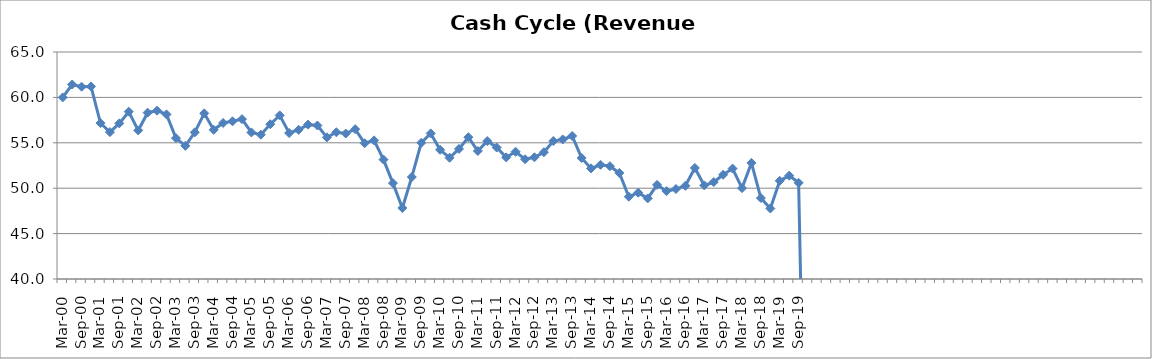
| Category | Series 0 |
|---|---|
| Mar-00 | 59.999 |
| Jun-00 | 61.42 |
| Sep-00 | 61.18 |
| Dec-00 | 61.208 |
| Mar-01 | 57.172 |
| Jun-01 | 56.177 |
| Sep-01 | 57.14 |
| Dec-01 | 58.427 |
| Mar-02 | 56.367 |
| Jun-02 | 58.318 |
| Sep-02 | 58.539 |
| Dec-02 | 58.126 |
| Mar-03 | 55.517 |
| Jun-03 | 54.667 |
| Sep-03 | 56.155 |
| Dec-03 | 58.246 |
| Mar-04 | 56.431 |
| Jun-04 | 57.187 |
| Sep-04 | 57.367 |
| Dec-04 | 57.605 |
| Mar-05 | 56.143 |
| Jun-05 | 55.893 |
| Sep-05 | 57.043 |
| Dec-05 | 58.02 |
| Mar-06 | 56.077 |
| Jun-06 | 56.43 |
| Sep-06 | 56.998 |
| Dec-06 | 56.905 |
| Mar-07 | 55.598 |
| Jun-07 | 56.163 |
| Sep-07 | 56.023 |
| Dec-07 | 56.498 |
| Mar-08 | 54.952 |
| Jun-08 | 55.266 |
| Sep-08 | 53.153 |
| Dec-08 | 50.562 |
| Mar-09 | 47.819 |
| Jun-09 | 51.23 |
| Sep-09 | 55.001 |
| Dec-09 | 56.034 |
| Mar-10 | 54.226 |
| Jun-10 | 53.354 |
| Sep-10 | 54.325 |
| Dec-10 | 55.616 |
| Mar-11 | 54.095 |
| Jun-11 | 55.191 |
| Sep-11 | 54.482 |
| Dec-11 | 53.393 |
| Mar-12 | 54.015 |
| Jun-12 | 53.19 |
| Sep-12 | 53.404 |
| Dec-12 | 53.963 |
| Mar-13 | 55.194 |
| Jun-13 | 55.37 |
| Sep-13 | 55.752 |
| Dec-13 | 53.329 |
| Mar-14 | 52.181 |
| Jun-14 | 52.573 |
| Sep-14 | 52.423 |
| Dec-14 | 51.682 |
| Mar-15 | 49.064 |
| Jun-15 | 49.5 |
| Sep-15 | 48.876 |
| Dec-15 | 50.366 |
| Mar-16 | 49.678 |
| Jun-16 | 49.912 |
| Sep-16 | 50.262 |
| Dec-16 | 52.231 |
| Mar-17 | 50.309 |
| Jun-17 | 50.677 |
| Sep-17 | 51.481 |
| Dec-17 | 52.16 |
| Mar-18 | 50.009 |
| Jun-18 | 52.784 |
| Sep-18 | 48.917 |
| Dec-18 | 47.765 |
| Mar-19 | 50.812 |
| Jun-19 | 51.383 |
| Sep-19 | 50.59 |